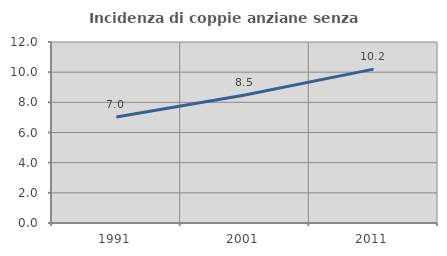
| Category | Incidenza di coppie anziane senza figli  |
|---|---|
| 1991.0 | 7.029 |
| 2001.0 | 8.486 |
| 2011.0 | 10.2 |